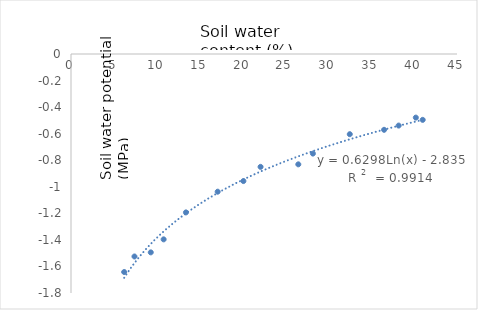
| Category | Series 0 |
|---|---|
| 41.0 | -0.496 |
| 40.2 | -0.479 |
| 38.2 | -0.539 |
| 36.5 | -0.571 |
| 32.5 | -0.604 |
| 28.2 | -0.75 |
| 26.5 | -0.831 |
| 22.1 | -0.85 |
| 20.1 | -0.957 |
| 17.1 | -1.037 |
| 13.4 | -1.193 |
| 10.8 | -1.396 |
| 9.3 | -1.494 |
| 7.4 | -1.525 |
| 6.2 | -1.642 |